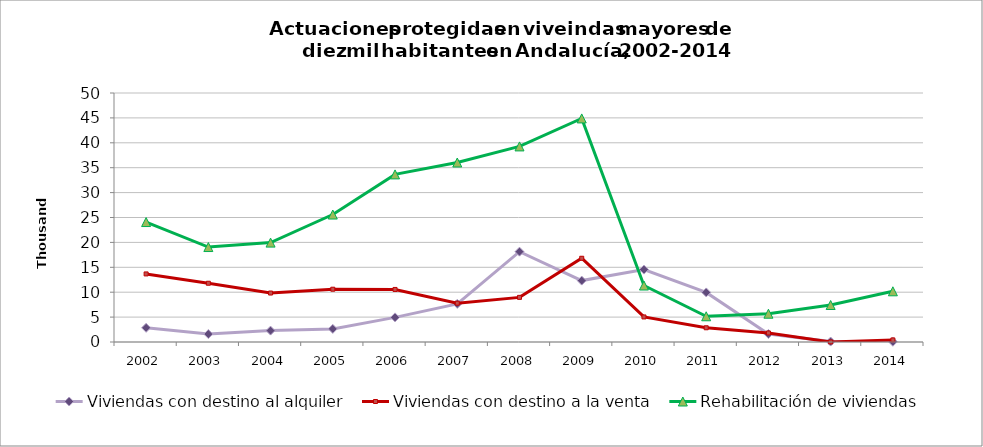
| Category | Viviendas con destino al alquiler | Viviendas con destino a la venta | Rehabilitación de viviendas |
|---|---|---|---|
| 2002.0 | 2848 | 13669 | 24087 |
| 2003.0 | 1593 | 11799 | 19070 |
| 2004.0 | 2288 | 9833 | 19958 |
| 2005.0 | 2634 | 10600 | 25595 |
| 2006.0 | 4943 | 10553 | 33655 |
| 2007.0 | 7652 | 7796 | 36044 |
| 2008.0 | 18138 | 8961 | 39275 |
| 2009.0 | 12330 | 16817 | 44893 |
| 2010.0 | 14539 | 5030 | 11342 |
| 2011.0 | 9955 | 2857 | 5166 |
| 2012.0 | 1606 | 1811 | 5680 |
| 2013.0 | 87 | 14 | 7430 |
| 2014.0 | 56 | 416 | 10179 |